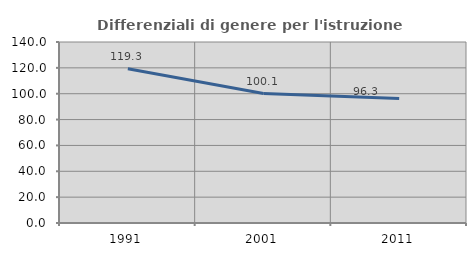
| Category | Differenziali di genere per l'istruzione superiore |
|---|---|
| 1991.0 | 119.269 |
| 2001.0 | 100.105 |
| 2011.0 | 96.251 |